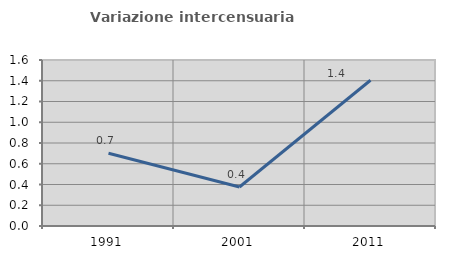
| Category | Variazione intercensuaria annua |
|---|---|
| 1991.0 | 0.701 |
| 2001.0 | 0.376 |
| 2011.0 | 1.405 |